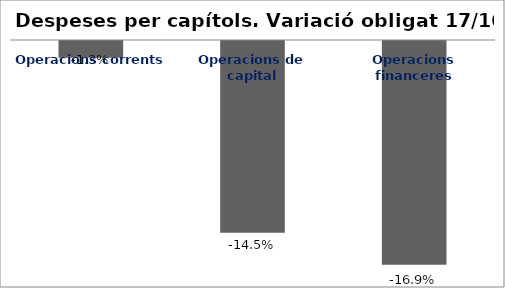
| Category | Series 0 |
|---|---|
| Operacions corrents | -0.013 |
| Operacions de capital | -0.145 |
| Operacions financeres | -0.169 |